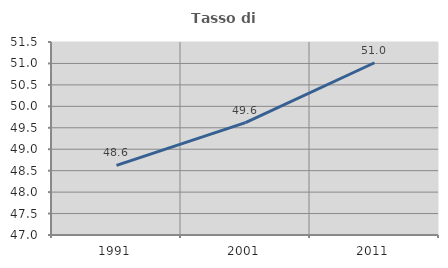
| Category | Tasso di occupazione   |
|---|---|
| 1991.0 | 48.623 |
| 2001.0 | 49.62 |
| 2011.0 | 51.016 |